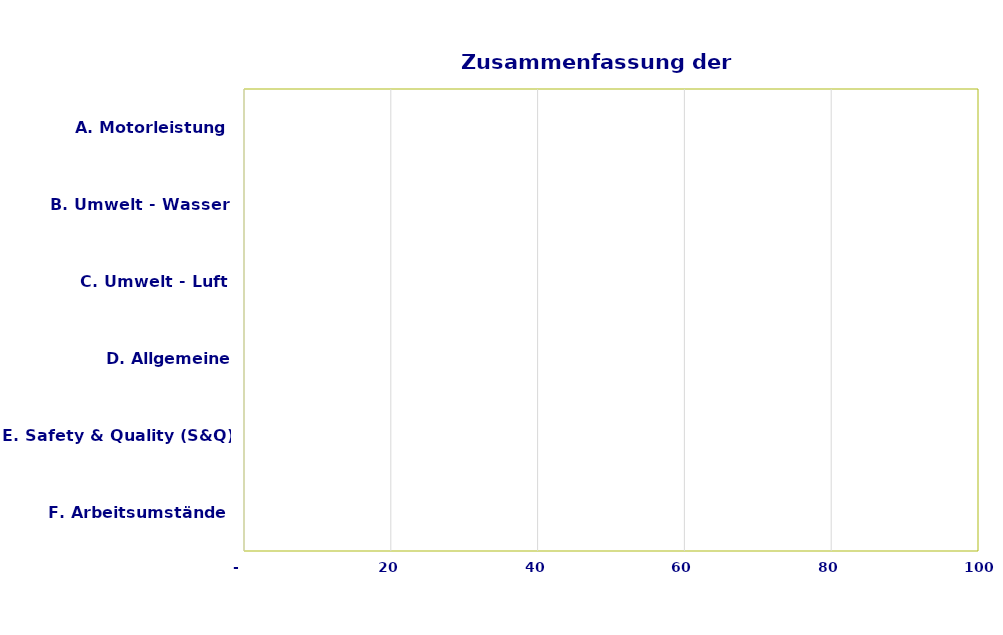
| Category | Score |
|---|---|
| F. Arbeitsumstände | 0 |
| E. Safety & Quality (S&Q) | 0 |
| D. Allgemeine Zertifizierung | 0 |
| C. Umwelt - Luft | 0 |
| B. Umwelt - Wasser | 0 |
| A. Motorleistung | 0 |